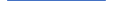
| Category | Series 0 |
|---|---|
| 0 | 67.006 |
| 1 | 48.474 |
| 2 | 74 |
| 3 | 70.348 |
| 4 | 75.25 |
| 5 | 58 |
| 6 | 67 |
| 7 | 78 |
| 8 | 58 |